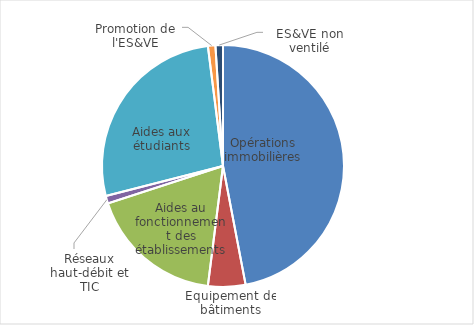
| Category | Opérations immobilières |
|---|---|
| Opérations immobilières | 0.47 |
| Equipement de bâtiments | 0.05 |
| Aides au fonctionnement des établissements | 0.18 |
| Réseaux haut-débit et TIC | 0.01 |
| Aides aux étudiants | 0.27 |
| Promotion de l'ES&VE | 0.01 |
| ES&VE non ventilé | 0.01 |